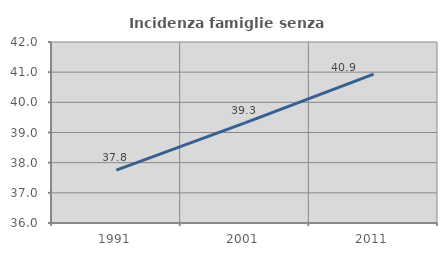
| Category | Incidenza famiglie senza nuclei |
|---|---|
| 1991.0 | 37.755 |
| 2001.0 | 39.32 |
| 2011.0 | 40.933 |